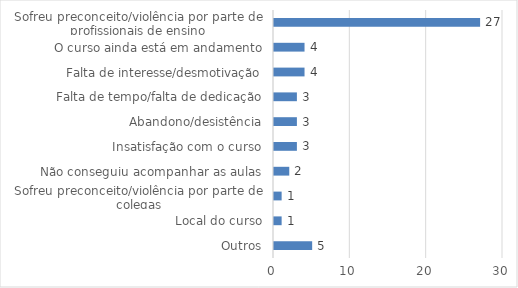
| Category | Series 0 |
|---|---|
| Outros | 5 |
| Local do curso | 1 |
| Sofreu preconceito/violência por parte de colegas | 1 |
| Não conseguiu acompanhar as aulas | 2 |
| Insatisfação com o curso | 3 |
| Abandono/desistência | 3 |
| Falta de tempo/falta de dedicação | 3 |
| Falta de interesse/desmotivação | 4 |
| O curso ainda está em andamento | 4 |
| Sofreu preconceito/violência por parte de profissionais de ensino | 27 |